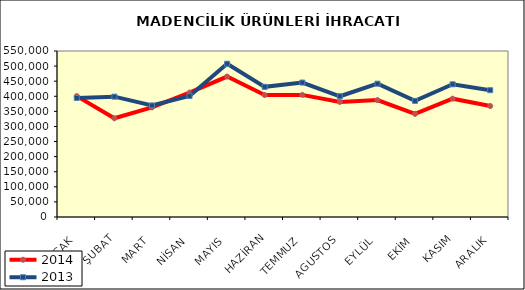
| Category | 2014 | 2013 |
|---|---|---|
| OCAK | 400471.495 | 394546.733 |
| ŞUBAT | 327055.846 | 398684.742 |
| MART | 363215.163 | 369661.433 |
| NİSAN | 412248.363 | 401154.977 |
| MAYIS | 465271.463 | 507825.643 |
| HAZİRAN | 404073.269 | 431230.647 |
| TEMMUZ | 404539.489 | 445448.032 |
| AGUSTOS | 381295.276 | 400043.062 |
| EYLÜL | 387378.383 | 441657.783 |
| EKİM | 341675.264 | 384744.099 |
| KASIM | 392057.68 | 439724.034 |
| ARALIK | 367663.464 | 420131.963 |